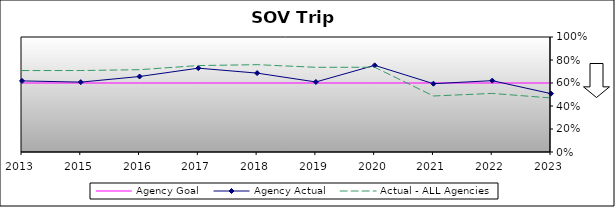
| Category | Agency Goal | Agency Actual | Actual - ALL Agencies |
|---|---|---|---|
| 2013.0 | 0.6 | 0.618 | 0.708 |
| 2015.0 | 0.6 | 0.608 | 0.708 |
| 2016.0 | 0.6 | 0.656 | 0.716 |
| 2017.0 | 0.6 | 0.729 | 0.752 |
| 2018.0 | 0.6 | 0.686 | 0.759 |
| 2019.0 | 0.6 | 0.609 | 0.736 |
| 2020.0 | 0.6 | 0.754 | 0.737 |
| 2021.0 | 0.6 | 0.594 | 0.487 |
| 2022.0 | 0.6 | 0.62 | 0.509 |
| 2023.0 | 0.6 | 0.507 | 0.47 |